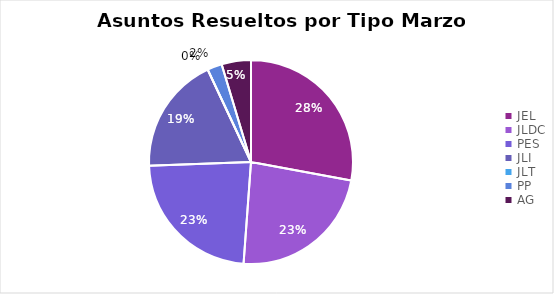
| Category | Series 0 |
|---|---|
| JEL | 12 |
| JLDC | 10 |
| PES | 10 |
| JLI | 8 |
| JLT | 0 |
| PP | 1 |
| AG | 2 |